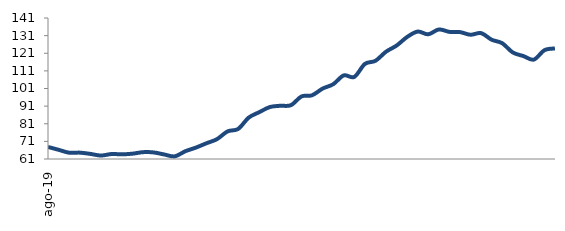
| Category | Series 0 |
|---|---|
| 2019-08-01 | 67.837 |
| 2019-09-01 | 66.22 |
| 2019-10-01 | 64.573 |
| 2019-11-01 | 64.608 |
| 2019-12-01 | 63.908 |
| 2020-01-01 | 62.959 |
| 2020-02-01 | 63.811 |
| 2020-03-01 | 63.665 |
| 2020-04-01 | 64.013 |
| 2020-05-01 | 64.885 |
| 2020-06-01 | 64.73 |
| 2020-07-01 | 63.568 |
| 2020-08-01 | 62.507 |
| 2020-09-01 | 65.409 |
| 2020-10-01 | 67.466 |
| 2020-11-01 | 69.929 |
| 2020-12-01 | 72.262 |
| 2021-01-01 | 76.667 |
| 2021-02-01 | 78.05 |
| 2021-03-01 | 84.474 |
| 2021-04-01 | 87.564 |
| 2021-05-01 | 90.47 |
| 2021-06-01 | 91.204 |
| 2021-07-01 | 91.538 |
| 2021-08-01 | 96.497 |
| 2021-09-01 | 97.152 |
| 2021-10-01 | 100.957 |
| 2021-11-01 | 103.422 |
| 2021-12-01 | 108.432 |
| 2022-01-01 | 107.584 |
| 2022-02-01 | 114.937 |
| 2022-03-01 | 116.708 |
| 2022-04-01 | 121.877 |
| 2022-05-01 | 125.358 |
| 2022-06-01 | 130.237 |
| 2022-07-01 | 133.304 |
| 2022-08-01 | 131.751 |
| 2022-09-01 | 134.487 |
| 2022-10-01 | 133.139 |
| 2022-11-01 | 133.012 |
| 2022-12-01 | 131.496 |
| 2023-01-01 | 132.43 |
| 2023-02-01 | 128.69 |
| 2023-03-01 | 126.696 |
| 2023-04-01 | 121.465 |
| 2023-05-01 | 119.417 |
| 2023-06-01 | 117.407 |
| 2023-07-01 | 122.739 |
| 2023-08-01 | 123.725 |